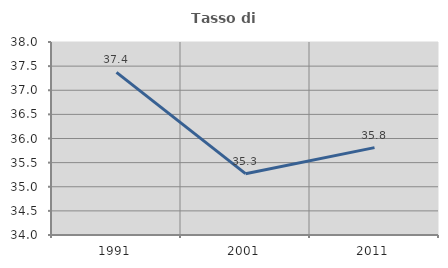
| Category | Tasso di occupazione   |
|---|---|
| 1991.0 | 37.37 |
| 2001.0 | 35.271 |
| 2011.0 | 35.811 |